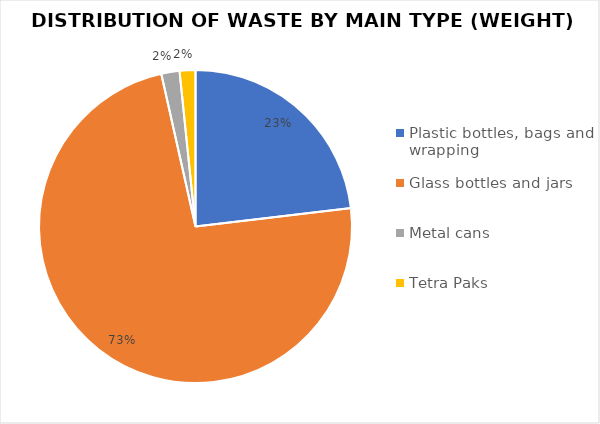
| Category | Series 0 |
|---|---|
| Plastic bottles, bags and wrapping | 494.718 |
| Glass bottles and jars | 1569.629 |
| Metal cans | 40.275 |
| Tetra Paks | 34.88 |